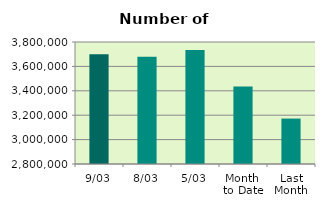
| Category | Series 0 |
|---|---|
| 9/03 | 3698682 |
| 8/03 | 3679680 |
| 5/03 | 3733402 |
| Month 
to Date | 3435644.286 |
| Last
Month | 3172414.4 |